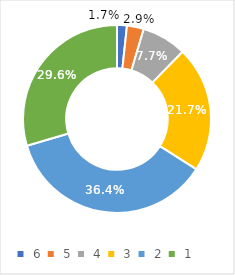
| Category | Series 0 |
|---|---|
|  6  | 0.017 |
|  5  | 0.029 |
|  4  | 0.077 |
|  3  | 0.217 |
|  2  | 0.364 |
|  1  | 0.296 |